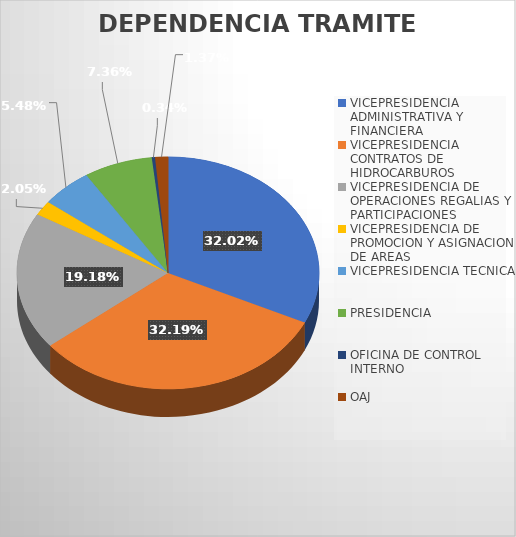
| Category | CANTIDAD |
|---|---|
| VICEPRESIDENCIA ADMINISTRATIVA Y FINANCIERA | 187 |
| VICEPRESIDENCIA CONTRATOS DE HIDROCARBUROS | 188 |
| VICEPRESIDENCIA DE OPERACIONES REGALIAS Y PARTICIPACIONES | 112 |
| VICEPRESIDENCIA DE PROMOCION Y ASIGNACION DE AREAS | 12 |
| VICEPRESIDENCIA TECNICA | 32 |
| PRESIDENCIA  | 43 |
| OFICINA DE CONTROL INTERNO | 2 |
| OAJ | 8 |